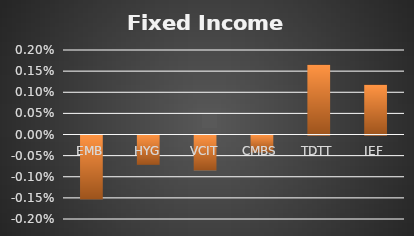
| Category | Series 0 |
|---|---|
| EMB | -0.002 |
| HYG | -0.001 |
| VCIT | -0.001 |
| CMBS | 0 |
| TDTT | 0.002 |
| IEF | 0.001 |